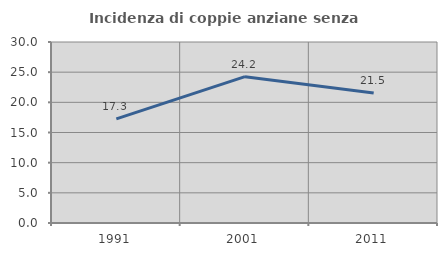
| Category | Incidenza di coppie anziane senza figli  |
|---|---|
| 1991.0 | 17.257 |
| 2001.0 | 24.249 |
| 2011.0 | 21.538 |